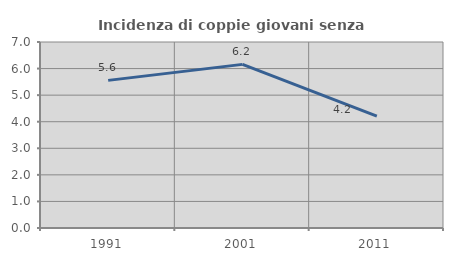
| Category | Incidenza di coppie giovani senza figli |
|---|---|
| 1991.0 | 5.556 |
| 2001.0 | 6.158 |
| 2011.0 | 4.208 |